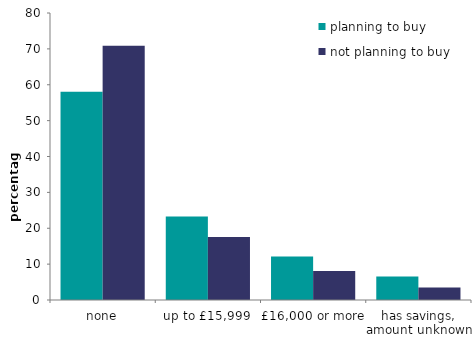
| Category | planning to buy | not planning to buy |
|---|---|---|
| none | 58.055 | 70.836 |
| up to £15,999 | 23.277 | 17.568 |
| £16,000 or more | 12.126 | 8.118 |
| has savings, amount unknown | 6.541 | 3.478 |